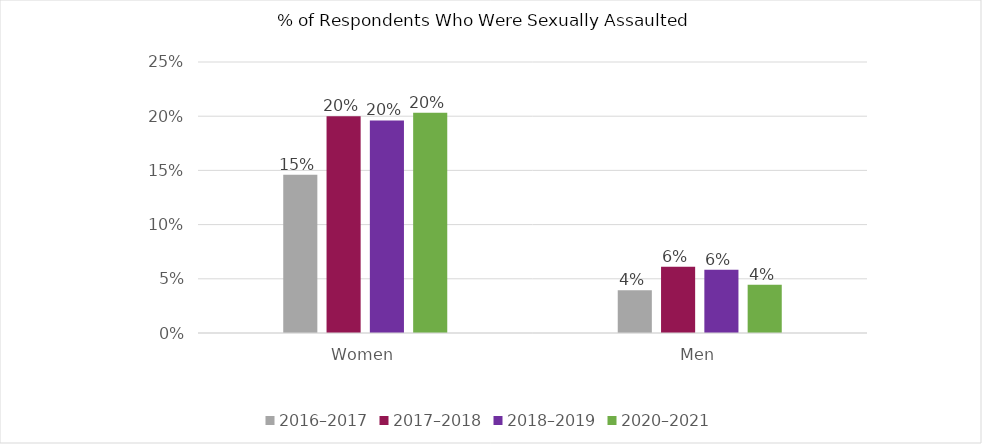
| Category | 2016–2017 | 2017–2018 | 2018–2019 | 2020–2021 |
|---|---|---|---|---|
| Women | 0.146 | 0.2 | 0.196 | 0.203 |
| Men | 0.039 | 0.061 | 0.058 | 0.044 |